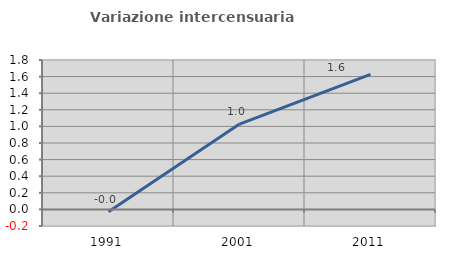
| Category | Variazione intercensuaria annua |
|---|---|
| 1991.0 | -0.03 |
| 2001.0 | 1.028 |
| 2011.0 | 1.626 |